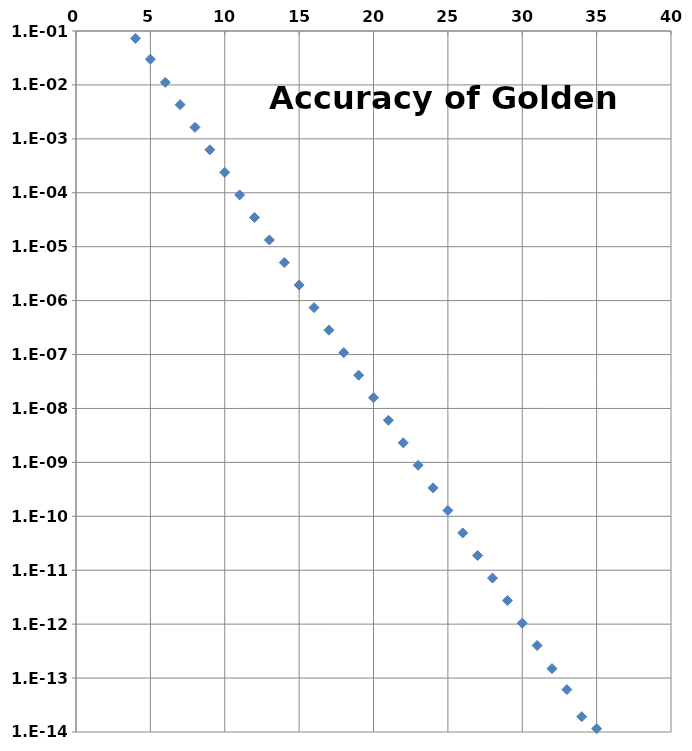
| Category | Series 0 |
|---|---|
| 4.0 | 0.073 |
| 5.0 | 0.03 |
| 6.0 | 0.011 |
| 7.0 | 0.004 |
| 8.0 | 0.002 |
| 9.0 | 0.001 |
| 10.0 | 0 |
| 11.0 | 0 |
| 12.0 | 0 |
| 13.0 | 0 |
| 14.0 | 0 |
| 15.0 | 0 |
| 16.0 | 0 |
| 17.0 | 0 |
| 18.0 | 0 |
| 19.0 | 0 |
| 20.0 | 0 |
| 21.0 | 0 |
| 22.0 | 0 |
| 23.0 | 0 |
| 24.0 | 0 |
| 25.0 | 0 |
| 26.0 | 0 |
| 27.0 | 0 |
| 28.0 | 0 |
| 29.0 | 0 |
| 30.0 | 0 |
| 31.0 | 0 |
| 32.0 | 0 |
| 33.0 | 0 |
| 34.0 | 0 |
| 35.0 | 0 |